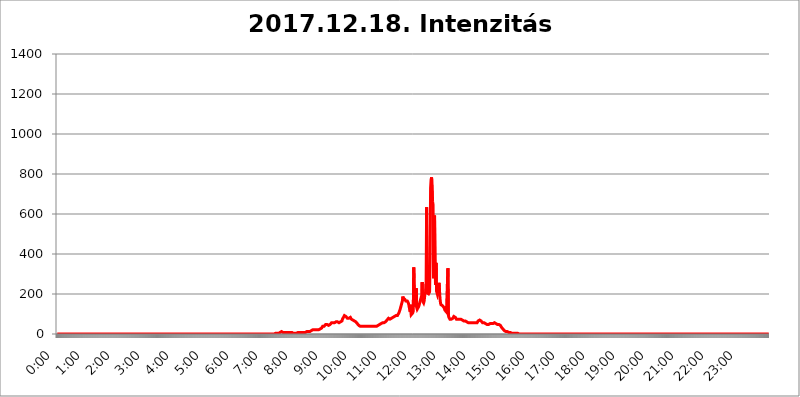
| Category | 2017.12.18. Intenzitás [W/m^2] |
|---|---|
| 0.0 | 0 |
| 0.0006944444444444445 | 0 |
| 0.001388888888888889 | 0 |
| 0.0020833333333333333 | 0 |
| 0.002777777777777778 | 0 |
| 0.003472222222222222 | 0 |
| 0.004166666666666667 | 0 |
| 0.004861111111111111 | 0 |
| 0.005555555555555556 | 0 |
| 0.0062499999999999995 | 0 |
| 0.006944444444444444 | 0 |
| 0.007638888888888889 | 0 |
| 0.008333333333333333 | 0 |
| 0.009027777777777779 | 0 |
| 0.009722222222222222 | 0 |
| 0.010416666666666666 | 0 |
| 0.011111111111111112 | 0 |
| 0.011805555555555555 | 0 |
| 0.012499999999999999 | 0 |
| 0.013194444444444444 | 0 |
| 0.013888888888888888 | 0 |
| 0.014583333333333332 | 0 |
| 0.015277777777777777 | 0 |
| 0.015972222222222224 | 0 |
| 0.016666666666666666 | 0 |
| 0.017361111111111112 | 0 |
| 0.018055555555555557 | 0 |
| 0.01875 | 0 |
| 0.019444444444444445 | 0 |
| 0.02013888888888889 | 0 |
| 0.020833333333333332 | 0 |
| 0.02152777777777778 | 0 |
| 0.022222222222222223 | 0 |
| 0.02291666666666667 | 0 |
| 0.02361111111111111 | 0 |
| 0.024305555555555556 | 0 |
| 0.024999999999999998 | 0 |
| 0.025694444444444447 | 0 |
| 0.02638888888888889 | 0 |
| 0.027083333333333334 | 0 |
| 0.027777777777777776 | 0 |
| 0.02847222222222222 | 0 |
| 0.029166666666666664 | 0 |
| 0.029861111111111113 | 0 |
| 0.030555555555555555 | 0 |
| 0.03125 | 0 |
| 0.03194444444444445 | 0 |
| 0.03263888888888889 | 0 |
| 0.03333333333333333 | 0 |
| 0.034027777777777775 | 0 |
| 0.034722222222222224 | 0 |
| 0.035416666666666666 | 0 |
| 0.036111111111111115 | 0 |
| 0.03680555555555556 | 0 |
| 0.0375 | 0 |
| 0.03819444444444444 | 0 |
| 0.03888888888888889 | 0 |
| 0.03958333333333333 | 0 |
| 0.04027777777777778 | 0 |
| 0.04097222222222222 | 0 |
| 0.041666666666666664 | 0 |
| 0.042361111111111106 | 0 |
| 0.04305555555555556 | 0 |
| 0.043750000000000004 | 0 |
| 0.044444444444444446 | 0 |
| 0.04513888888888889 | 0 |
| 0.04583333333333334 | 0 |
| 0.04652777777777778 | 0 |
| 0.04722222222222222 | 0 |
| 0.04791666666666666 | 0 |
| 0.04861111111111111 | 0 |
| 0.049305555555555554 | 0 |
| 0.049999999999999996 | 0 |
| 0.05069444444444445 | 0 |
| 0.051388888888888894 | 0 |
| 0.052083333333333336 | 0 |
| 0.05277777777777778 | 0 |
| 0.05347222222222222 | 0 |
| 0.05416666666666667 | 0 |
| 0.05486111111111111 | 0 |
| 0.05555555555555555 | 0 |
| 0.05625 | 0 |
| 0.05694444444444444 | 0 |
| 0.057638888888888885 | 0 |
| 0.05833333333333333 | 0 |
| 0.05902777777777778 | 0 |
| 0.059722222222222225 | 0 |
| 0.06041666666666667 | 0 |
| 0.061111111111111116 | 0 |
| 0.06180555555555556 | 0 |
| 0.0625 | 0 |
| 0.06319444444444444 | 0 |
| 0.06388888888888888 | 0 |
| 0.06458333333333334 | 0 |
| 0.06527777777777778 | 0 |
| 0.06597222222222222 | 0 |
| 0.06666666666666667 | 0 |
| 0.06736111111111111 | 0 |
| 0.06805555555555555 | 0 |
| 0.06874999999999999 | 0 |
| 0.06944444444444443 | 0 |
| 0.07013888888888889 | 0 |
| 0.07083333333333333 | 0 |
| 0.07152777777777779 | 0 |
| 0.07222222222222223 | 0 |
| 0.07291666666666667 | 0 |
| 0.07361111111111111 | 0 |
| 0.07430555555555556 | 0 |
| 0.075 | 0 |
| 0.07569444444444444 | 0 |
| 0.0763888888888889 | 0 |
| 0.07708333333333334 | 0 |
| 0.07777777777777778 | 0 |
| 0.07847222222222222 | 0 |
| 0.07916666666666666 | 0 |
| 0.0798611111111111 | 0 |
| 0.08055555555555556 | 0 |
| 0.08125 | 0 |
| 0.08194444444444444 | 0 |
| 0.08263888888888889 | 0 |
| 0.08333333333333333 | 0 |
| 0.08402777777777777 | 0 |
| 0.08472222222222221 | 0 |
| 0.08541666666666665 | 0 |
| 0.08611111111111112 | 0 |
| 0.08680555555555557 | 0 |
| 0.08750000000000001 | 0 |
| 0.08819444444444445 | 0 |
| 0.08888888888888889 | 0 |
| 0.08958333333333333 | 0 |
| 0.09027777777777778 | 0 |
| 0.09097222222222222 | 0 |
| 0.09166666666666667 | 0 |
| 0.09236111111111112 | 0 |
| 0.09305555555555556 | 0 |
| 0.09375 | 0 |
| 0.09444444444444444 | 0 |
| 0.09513888888888888 | 0 |
| 0.09583333333333333 | 0 |
| 0.09652777777777777 | 0 |
| 0.09722222222222222 | 0 |
| 0.09791666666666667 | 0 |
| 0.09861111111111111 | 0 |
| 0.09930555555555555 | 0 |
| 0.09999999999999999 | 0 |
| 0.10069444444444443 | 0 |
| 0.1013888888888889 | 0 |
| 0.10208333333333335 | 0 |
| 0.10277777777777779 | 0 |
| 0.10347222222222223 | 0 |
| 0.10416666666666667 | 0 |
| 0.10486111111111111 | 0 |
| 0.10555555555555556 | 0 |
| 0.10625 | 0 |
| 0.10694444444444444 | 0 |
| 0.1076388888888889 | 0 |
| 0.10833333333333334 | 0 |
| 0.10902777777777778 | 0 |
| 0.10972222222222222 | 0 |
| 0.1111111111111111 | 0 |
| 0.11180555555555556 | 0 |
| 0.11180555555555556 | 0 |
| 0.1125 | 0 |
| 0.11319444444444444 | 0 |
| 0.11388888888888889 | 0 |
| 0.11458333333333333 | 0 |
| 0.11527777777777777 | 0 |
| 0.11597222222222221 | 0 |
| 0.11666666666666665 | 0 |
| 0.1173611111111111 | 0 |
| 0.11805555555555557 | 0 |
| 0.11944444444444445 | 0 |
| 0.12013888888888889 | 0 |
| 0.12083333333333333 | 0 |
| 0.12152777777777778 | 0 |
| 0.12222222222222223 | 0 |
| 0.12291666666666667 | 0 |
| 0.12291666666666667 | 0 |
| 0.12361111111111112 | 0 |
| 0.12430555555555556 | 0 |
| 0.125 | 0 |
| 0.12569444444444444 | 0 |
| 0.12638888888888888 | 0 |
| 0.12708333333333333 | 0 |
| 0.16875 | 0 |
| 0.12847222222222224 | 0 |
| 0.12916666666666668 | 0 |
| 0.12986111111111112 | 0 |
| 0.13055555555555556 | 0 |
| 0.13125 | 0 |
| 0.13194444444444445 | 0 |
| 0.1326388888888889 | 0 |
| 0.13333333333333333 | 0 |
| 0.13402777777777777 | 0 |
| 0.13402777777777777 | 0 |
| 0.13472222222222222 | 0 |
| 0.13541666666666666 | 0 |
| 0.1361111111111111 | 0 |
| 0.13749999999999998 | 0 |
| 0.13819444444444443 | 0 |
| 0.1388888888888889 | 0 |
| 0.13958333333333334 | 0 |
| 0.14027777777777778 | 0 |
| 0.14097222222222222 | 0 |
| 0.14166666666666666 | 0 |
| 0.1423611111111111 | 0 |
| 0.14305555555555557 | 0 |
| 0.14375000000000002 | 0 |
| 0.14444444444444446 | 0 |
| 0.1451388888888889 | 0 |
| 0.1451388888888889 | 0 |
| 0.14652777777777778 | 0 |
| 0.14722222222222223 | 0 |
| 0.14791666666666667 | 0 |
| 0.1486111111111111 | 0 |
| 0.14930555555555555 | 0 |
| 0.15 | 0 |
| 0.15069444444444444 | 0 |
| 0.15138888888888888 | 0 |
| 0.15208333333333332 | 0 |
| 0.15277777777777776 | 0 |
| 0.15347222222222223 | 0 |
| 0.15416666666666667 | 0 |
| 0.15486111111111112 | 0 |
| 0.15555555555555556 | 0 |
| 0.15625 | 0 |
| 0.15694444444444444 | 0 |
| 0.15763888888888888 | 0 |
| 0.15833333333333333 | 0 |
| 0.15902777777777777 | 0 |
| 0.15972222222222224 | 0 |
| 0.16041666666666668 | 0 |
| 0.16111111111111112 | 0 |
| 0.16180555555555556 | 0 |
| 0.1625 | 0 |
| 0.16319444444444445 | 0 |
| 0.1638888888888889 | 0 |
| 0.16458333333333333 | 0 |
| 0.16527777777777777 | 0 |
| 0.16597222222222222 | 0 |
| 0.16666666666666666 | 0 |
| 0.1673611111111111 | 0 |
| 0.16805555555555554 | 0 |
| 0.16874999999999998 | 0 |
| 0.16944444444444443 | 0 |
| 0.17013888888888887 | 0 |
| 0.1708333333333333 | 0 |
| 0.17152777777777775 | 0 |
| 0.17222222222222225 | 0 |
| 0.1729166666666667 | 0 |
| 0.17361111111111113 | 0 |
| 0.17430555555555557 | 0 |
| 0.17500000000000002 | 0 |
| 0.17569444444444446 | 0 |
| 0.1763888888888889 | 0 |
| 0.17708333333333334 | 0 |
| 0.17777777777777778 | 0 |
| 0.17847222222222223 | 0 |
| 0.17916666666666667 | 0 |
| 0.1798611111111111 | 0 |
| 0.18055555555555555 | 0 |
| 0.18125 | 0 |
| 0.18194444444444444 | 0 |
| 0.1826388888888889 | 0 |
| 0.18333333333333335 | 0 |
| 0.1840277777777778 | 0 |
| 0.18472222222222223 | 0 |
| 0.18541666666666667 | 0 |
| 0.18611111111111112 | 0 |
| 0.18680555555555556 | 0 |
| 0.1875 | 0 |
| 0.18819444444444444 | 0 |
| 0.18888888888888888 | 0 |
| 0.18958333333333333 | 0 |
| 0.19027777777777777 | 0 |
| 0.1909722222222222 | 0 |
| 0.19166666666666665 | 0 |
| 0.19236111111111112 | 0 |
| 0.19305555555555554 | 0 |
| 0.19375 | 0 |
| 0.19444444444444445 | 0 |
| 0.1951388888888889 | 0 |
| 0.19583333333333333 | 0 |
| 0.19652777777777777 | 0 |
| 0.19722222222222222 | 0 |
| 0.19791666666666666 | 0 |
| 0.1986111111111111 | 0 |
| 0.19930555555555554 | 0 |
| 0.19999999999999998 | 0 |
| 0.20069444444444443 | 0 |
| 0.20138888888888887 | 0 |
| 0.2020833333333333 | 0 |
| 0.2027777777777778 | 0 |
| 0.2034722222222222 | 0 |
| 0.2041666666666667 | 0 |
| 0.20486111111111113 | 0 |
| 0.20555555555555557 | 0 |
| 0.20625000000000002 | 0 |
| 0.20694444444444446 | 0 |
| 0.2076388888888889 | 0 |
| 0.20833333333333334 | 0 |
| 0.20902777777777778 | 0 |
| 0.20972222222222223 | 0 |
| 0.21041666666666667 | 0 |
| 0.2111111111111111 | 0 |
| 0.21180555555555555 | 0 |
| 0.2125 | 0 |
| 0.21319444444444444 | 0 |
| 0.2138888888888889 | 0 |
| 0.21458333333333335 | 0 |
| 0.2152777777777778 | 0 |
| 0.21597222222222223 | 0 |
| 0.21666666666666667 | 0 |
| 0.21736111111111112 | 0 |
| 0.21805555555555556 | 0 |
| 0.21875 | 0 |
| 0.21944444444444444 | 0 |
| 0.22013888888888888 | 0 |
| 0.22083333333333333 | 0 |
| 0.22152777777777777 | 0 |
| 0.2222222222222222 | 0 |
| 0.22291666666666665 | 0 |
| 0.2236111111111111 | 0 |
| 0.22430555555555556 | 0 |
| 0.225 | 0 |
| 0.22569444444444445 | 0 |
| 0.2263888888888889 | 0 |
| 0.22708333333333333 | 0 |
| 0.22777777777777777 | 0 |
| 0.22847222222222222 | 0 |
| 0.22916666666666666 | 0 |
| 0.2298611111111111 | 0 |
| 0.23055555555555554 | 0 |
| 0.23124999999999998 | 0 |
| 0.23194444444444443 | 0 |
| 0.23263888888888887 | 0 |
| 0.2333333333333333 | 0 |
| 0.2340277777777778 | 0 |
| 0.2347222222222222 | 0 |
| 0.2354166666666667 | 0 |
| 0.23611111111111113 | 0 |
| 0.23680555555555557 | 0 |
| 0.23750000000000002 | 0 |
| 0.23819444444444446 | 0 |
| 0.2388888888888889 | 0 |
| 0.23958333333333334 | 0 |
| 0.24027777777777778 | 0 |
| 0.24097222222222223 | 0 |
| 0.24166666666666667 | 0 |
| 0.2423611111111111 | 0 |
| 0.24305555555555555 | 0 |
| 0.24375 | 0 |
| 0.24444444444444446 | 0 |
| 0.24513888888888888 | 0 |
| 0.24583333333333335 | 0 |
| 0.2465277777777778 | 0 |
| 0.24722222222222223 | 0 |
| 0.24791666666666667 | 0 |
| 0.24861111111111112 | 0 |
| 0.24930555555555556 | 0 |
| 0.25 | 0 |
| 0.25069444444444444 | 0 |
| 0.2513888888888889 | 0 |
| 0.2520833333333333 | 0 |
| 0.25277777777777777 | 0 |
| 0.2534722222222222 | 0 |
| 0.25416666666666665 | 0 |
| 0.2548611111111111 | 0 |
| 0.2555555555555556 | 0 |
| 0.25625000000000003 | 0 |
| 0.2569444444444445 | 0 |
| 0.2576388888888889 | 0 |
| 0.25833333333333336 | 0 |
| 0.2590277777777778 | 0 |
| 0.25972222222222224 | 0 |
| 0.2604166666666667 | 0 |
| 0.2611111111111111 | 0 |
| 0.26180555555555557 | 0 |
| 0.2625 | 0 |
| 0.26319444444444445 | 0 |
| 0.2638888888888889 | 0 |
| 0.26458333333333334 | 0 |
| 0.2652777777777778 | 0 |
| 0.2659722222222222 | 0 |
| 0.26666666666666666 | 0 |
| 0.2673611111111111 | 0 |
| 0.26805555555555555 | 0 |
| 0.26875 | 0 |
| 0.26944444444444443 | 0 |
| 0.2701388888888889 | 0 |
| 0.2708333333333333 | 0 |
| 0.27152777777777776 | 0 |
| 0.2722222222222222 | 0 |
| 0.27291666666666664 | 0 |
| 0.2736111111111111 | 0 |
| 0.2743055555555555 | 0 |
| 0.27499999999999997 | 0 |
| 0.27569444444444446 | 0 |
| 0.27638888888888885 | 0 |
| 0.27708333333333335 | 0 |
| 0.2777777777777778 | 0 |
| 0.27847222222222223 | 0 |
| 0.2791666666666667 | 0 |
| 0.2798611111111111 | 0 |
| 0.28055555555555556 | 0 |
| 0.28125 | 0 |
| 0.28194444444444444 | 0 |
| 0.2826388888888889 | 0 |
| 0.2833333333333333 | 0 |
| 0.28402777777777777 | 0 |
| 0.2847222222222222 | 0 |
| 0.28541666666666665 | 0 |
| 0.28611111111111115 | 0 |
| 0.28680555555555554 | 0 |
| 0.28750000000000003 | 0 |
| 0.2881944444444445 | 0 |
| 0.2888888888888889 | 0 |
| 0.28958333333333336 | 0 |
| 0.2902777777777778 | 0 |
| 0.29097222222222224 | 0 |
| 0.2916666666666667 | 0 |
| 0.2923611111111111 | 0 |
| 0.29305555555555557 | 0 |
| 0.29375 | 0 |
| 0.29444444444444445 | 0 |
| 0.2951388888888889 | 0 |
| 0.29583333333333334 | 0 |
| 0.2965277777777778 | 0 |
| 0.2972222222222222 | 0 |
| 0.29791666666666666 | 0 |
| 0.2986111111111111 | 0 |
| 0.29930555555555555 | 0 |
| 0.3 | 0 |
| 0.30069444444444443 | 0 |
| 0.3013888888888889 | 0 |
| 0.3020833333333333 | 0 |
| 0.30277777777777776 | 0 |
| 0.3034722222222222 | 0 |
| 0.30416666666666664 | 0 |
| 0.3048611111111111 | 0 |
| 0.3055555555555555 | 0 |
| 0.30624999999999997 | 3.525 |
| 0.3069444444444444 | 3.525 |
| 0.3076388888888889 | 3.525 |
| 0.30833333333333335 | 3.525 |
| 0.3090277777777778 | 3.525 |
| 0.30972222222222223 | 3.525 |
| 0.3104166666666667 | 3.525 |
| 0.3111111111111111 | 7.887 |
| 0.31180555555555556 | 7.887 |
| 0.3125 | 7.887 |
| 0.31319444444444444 | 7.887 |
| 0.3138888888888889 | 12.257 |
| 0.3145833333333333 | 12.257 |
| 0.31527777777777777 | 12.257 |
| 0.3159722222222222 | 7.887 |
| 0.31666666666666665 | 7.887 |
| 0.31736111111111115 | 7.887 |
| 0.31805555555555554 | 7.887 |
| 0.31875000000000003 | 7.887 |
| 0.3194444444444445 | 7.887 |
| 0.3201388888888889 | 7.887 |
| 0.32083333333333336 | 7.887 |
| 0.3215277777777778 | 7.887 |
| 0.32222222222222224 | 7.887 |
| 0.3229166666666667 | 7.887 |
| 0.3236111111111111 | 7.887 |
| 0.32430555555555557 | 7.887 |
| 0.325 | 7.887 |
| 0.32569444444444445 | 7.887 |
| 0.3263888888888889 | 7.887 |
| 0.32708333333333334 | 7.887 |
| 0.3277777777777778 | 7.887 |
| 0.3284722222222222 | 7.887 |
| 0.32916666666666666 | 7.887 |
| 0.3298611111111111 | 7.887 |
| 0.33055555555555555 | 3.525 |
| 0.33125 | 3.525 |
| 0.33194444444444443 | 3.525 |
| 0.3326388888888889 | 3.525 |
| 0.3333333333333333 | 3.525 |
| 0.3340277777777778 | 3.525 |
| 0.3347222222222222 | 3.525 |
| 0.3354166666666667 | 3.525 |
| 0.3361111111111111 | 3.525 |
| 0.3368055555555556 | 7.887 |
| 0.33749999999999997 | 7.887 |
| 0.33819444444444446 | 7.887 |
| 0.33888888888888885 | 7.887 |
| 0.33958333333333335 | 7.887 |
| 0.34027777777777773 | 7.887 |
| 0.34097222222222223 | 7.887 |
| 0.3416666666666666 | 7.887 |
| 0.3423611111111111 | 7.887 |
| 0.3430555555555555 | 7.887 |
| 0.34375 | 7.887 |
| 0.3444444444444445 | 7.887 |
| 0.3451388888888889 | 7.887 |
| 0.3458333333333334 | 7.887 |
| 0.34652777777777777 | 7.887 |
| 0.34722222222222227 | 7.887 |
| 0.34791666666666665 | 7.887 |
| 0.34861111111111115 | 7.887 |
| 0.34930555555555554 | 12.257 |
| 0.35000000000000003 | 12.257 |
| 0.3506944444444444 | 12.257 |
| 0.3513888888888889 | 12.257 |
| 0.3520833333333333 | 12.257 |
| 0.3527777777777778 | 12.257 |
| 0.3534722222222222 | 12.257 |
| 0.3541666666666667 | 12.257 |
| 0.3548611111111111 | 16.636 |
| 0.35555555555555557 | 16.636 |
| 0.35625 | 16.636 |
| 0.35694444444444445 | 16.636 |
| 0.3576388888888889 | 16.636 |
| 0.35833333333333334 | 21.024 |
| 0.3590277777777778 | 16.636 |
| 0.3597222222222222 | 16.636 |
| 0.36041666666666666 | 21.024 |
| 0.3611111111111111 | 21.024 |
| 0.36180555555555555 | 21.024 |
| 0.3625 | 21.024 |
| 0.36319444444444443 | 21.024 |
| 0.3638888888888889 | 21.024 |
| 0.3645833333333333 | 21.024 |
| 0.3652777777777778 | 21.024 |
| 0.3659722222222222 | 21.024 |
| 0.3666666666666667 | 21.024 |
| 0.3673611111111111 | 21.024 |
| 0.3680555555555556 | 25.419 |
| 0.36874999999999997 | 25.419 |
| 0.36944444444444446 | 29.823 |
| 0.37013888888888885 | 29.823 |
| 0.37083333333333335 | 29.823 |
| 0.37152777777777773 | 34.234 |
| 0.37222222222222223 | 38.653 |
| 0.3729166666666666 | 38.653 |
| 0.3736111111111111 | 38.653 |
| 0.3743055555555555 | 38.653 |
| 0.375 | 43.079 |
| 0.3756944444444445 | 43.079 |
| 0.3763888888888889 | 47.511 |
| 0.3770833333333334 | 47.511 |
| 0.37777777777777777 | 47.511 |
| 0.37847222222222227 | 47.511 |
| 0.37916666666666665 | 47.511 |
| 0.37986111111111115 | 43.079 |
| 0.38055555555555554 | 43.079 |
| 0.38125000000000003 | 43.079 |
| 0.3819444444444444 | 47.511 |
| 0.3826388888888889 | 47.511 |
| 0.3833333333333333 | 47.511 |
| 0.3840277777777778 | 51.951 |
| 0.3847222222222222 | 56.398 |
| 0.3854166666666667 | 56.398 |
| 0.3861111111111111 | 56.398 |
| 0.38680555555555557 | 56.398 |
| 0.3875 | 56.398 |
| 0.38819444444444445 | 56.398 |
| 0.3888888888888889 | 56.398 |
| 0.38958333333333334 | 56.398 |
| 0.3902777777777778 | 60.85 |
| 0.3909722222222222 | 60.85 |
| 0.39166666666666666 | 60.85 |
| 0.3923611111111111 | 60.85 |
| 0.39305555555555555 | 60.85 |
| 0.39375 | 60.85 |
| 0.39444444444444443 | 60.85 |
| 0.3951388888888889 | 56.398 |
| 0.3958333333333333 | 56.398 |
| 0.3965277777777778 | 56.398 |
| 0.3972222222222222 | 60.85 |
| 0.3979166666666667 | 60.85 |
| 0.3986111111111111 | 65.31 |
| 0.3993055555555556 | 65.31 |
| 0.39999999999999997 | 74.246 |
| 0.40069444444444446 | 78.722 |
| 0.40138888888888885 | 83.205 |
| 0.40208333333333335 | 87.692 |
| 0.40277777777777773 | 92.184 |
| 0.40347222222222223 | 92.184 |
| 0.4041666666666666 | 92.184 |
| 0.4048611111111111 | 87.692 |
| 0.4055555555555555 | 83.205 |
| 0.40625 | 83.205 |
| 0.4069444444444445 | 78.722 |
| 0.4076388888888889 | 78.722 |
| 0.4083333333333334 | 78.722 |
| 0.40902777777777777 | 78.722 |
| 0.40972222222222227 | 78.722 |
| 0.41041666666666665 | 78.722 |
| 0.41111111111111115 | 83.205 |
| 0.41180555555555554 | 78.722 |
| 0.41250000000000003 | 74.246 |
| 0.4131944444444444 | 74.246 |
| 0.4138888888888889 | 69.775 |
| 0.4145833333333333 | 69.775 |
| 0.4152777777777778 | 65.31 |
| 0.4159722222222222 | 65.31 |
| 0.4166666666666667 | 65.31 |
| 0.4173611111111111 | 65.31 |
| 0.41805555555555557 | 65.31 |
| 0.41875 | 60.85 |
| 0.41944444444444445 | 60.85 |
| 0.4201388888888889 | 56.398 |
| 0.42083333333333334 | 51.951 |
| 0.4215277777777778 | 51.951 |
| 0.4222222222222222 | 47.511 |
| 0.42291666666666666 | 43.079 |
| 0.4236111111111111 | 43.079 |
| 0.42430555555555555 | 38.653 |
| 0.425 | 38.653 |
| 0.42569444444444443 | 38.653 |
| 0.4263888888888889 | 38.653 |
| 0.4270833333333333 | 38.653 |
| 0.4277777777777778 | 38.653 |
| 0.4284722222222222 | 38.653 |
| 0.4291666666666667 | 38.653 |
| 0.4298611111111111 | 38.653 |
| 0.4305555555555556 | 38.653 |
| 0.43124999999999997 | 38.653 |
| 0.43194444444444446 | 38.653 |
| 0.43263888888888885 | 38.653 |
| 0.43333333333333335 | 38.653 |
| 0.43402777777777773 | 38.653 |
| 0.43472222222222223 | 38.653 |
| 0.4354166666666666 | 38.653 |
| 0.4361111111111111 | 38.653 |
| 0.4368055555555555 | 38.653 |
| 0.4375 | 38.653 |
| 0.4381944444444445 | 38.653 |
| 0.4388888888888889 | 38.653 |
| 0.4395833333333334 | 38.653 |
| 0.44027777777777777 | 43.079 |
| 0.44097222222222227 | 43.079 |
| 0.44166666666666665 | 38.653 |
| 0.44236111111111115 | 38.653 |
| 0.44305555555555554 | 38.653 |
| 0.44375000000000003 | 38.653 |
| 0.4444444444444444 | 38.653 |
| 0.4451388888888889 | 43.079 |
| 0.4458333333333333 | 38.653 |
| 0.4465277777777778 | 38.653 |
| 0.4472222222222222 | 38.653 |
| 0.4479166666666667 | 38.653 |
| 0.4486111111111111 | 38.653 |
| 0.44930555555555557 | 43.079 |
| 0.45 | 43.079 |
| 0.45069444444444445 | 43.079 |
| 0.4513888888888889 | 43.079 |
| 0.45208333333333334 | 47.511 |
| 0.4527777777777778 | 47.511 |
| 0.4534722222222222 | 47.511 |
| 0.45416666666666666 | 51.951 |
| 0.4548611111111111 | 51.951 |
| 0.45555555555555555 | 56.398 |
| 0.45625 | 56.398 |
| 0.45694444444444443 | 56.398 |
| 0.4576388888888889 | 56.398 |
| 0.4583333333333333 | 56.398 |
| 0.4590277777777778 | 56.398 |
| 0.4597222222222222 | 60.85 |
| 0.4604166666666667 | 60.85 |
| 0.4611111111111111 | 65.31 |
| 0.4618055555555556 | 65.31 |
| 0.46249999999999997 | 69.775 |
| 0.46319444444444446 | 74.246 |
| 0.46388888888888885 | 74.246 |
| 0.46458333333333335 | 78.722 |
| 0.46527777777777773 | 78.722 |
| 0.46597222222222223 | 78.722 |
| 0.4666666666666666 | 74.246 |
| 0.4673611111111111 | 74.246 |
| 0.4680555555555555 | 78.722 |
| 0.46875 | 78.722 |
| 0.4694444444444445 | 83.205 |
| 0.4701388888888889 | 83.205 |
| 0.4708333333333334 | 83.205 |
| 0.47152777777777777 | 83.205 |
| 0.47222222222222227 | 87.692 |
| 0.47291666666666665 | 87.692 |
| 0.47361111111111115 | 92.184 |
| 0.47430555555555554 | 92.184 |
| 0.47500000000000003 | 92.184 |
| 0.4756944444444444 | 87.692 |
| 0.4763888888888889 | 87.692 |
| 0.4770833333333333 | 92.184 |
| 0.4777777777777778 | 92.184 |
| 0.4784722222222222 | 96.682 |
| 0.4791666666666667 | 105.69 |
| 0.4798611111111111 | 110.201 |
| 0.48055555555555557 | 119.235 |
| 0.48125 | 128.284 |
| 0.48194444444444445 | 137.347 |
| 0.4826388888888889 | 146.423 |
| 0.48333333333333334 | 155.509 |
| 0.4840277777777778 | 164.605 |
| 0.4847222222222222 | 187.378 |
| 0.48541666666666666 | 178.264 |
| 0.4861111111111111 | 182.82 |
| 0.48680555555555555 | 178.264 |
| 0.4875 | 173.709 |
| 0.48819444444444443 | 169.156 |
| 0.4888888888888889 | 164.605 |
| 0.4895833333333333 | 164.605 |
| 0.4902777777777778 | 164.605 |
| 0.4909722222222222 | 164.605 |
| 0.4916666666666667 | 160.056 |
| 0.4923611111111111 | 155.509 |
| 0.4930555555555556 | 146.423 |
| 0.49374999999999997 | 132.814 |
| 0.49444444444444446 | 119.235 |
| 0.49513888888888885 | 110.201 |
| 0.49583333333333335 | 146.423 |
| 0.49652777777777773 | 96.682 |
| 0.49722222222222223 | 96.682 |
| 0.4979166666666666 | 101.184 |
| 0.4986111111111111 | 105.69 |
| 0.4993055555555555 | 114.716 |
| 0.5 | 333.113 |
| 0.5006944444444444 | 219.309 |
| 0.5013888888888889 | 137.347 |
| 0.5020833333333333 | 132.814 |
| 0.5027777777777778 | 132.814 |
| 0.5034722222222222 | 228.436 |
| 0.5041666666666667 | 132.814 |
| 0.5048611111111111 | 123.758 |
| 0.5055555555555555 | 123.758 |
| 0.50625 | 123.758 |
| 0.5069444444444444 | 137.347 |
| 0.5076388888888889 | 146.423 |
| 0.5083333333333333 | 150.964 |
| 0.5090277777777777 | 164.605 |
| 0.5097222222222222 | 173.709 |
| 0.5104166666666666 | 169.156 |
| 0.5111111111111112 | 191.937 |
| 0.5118055555555555 | 260.373 |
| 0.5125000000000001 | 164.605 |
| 0.5131944444444444 | 160.056 |
| 0.513888888888889 | 155.509 |
| 0.5145833333333333 | 164.605 |
| 0.5152777777777778 | 187.378 |
| 0.5159722222222222 | 210.182 |
| 0.5166666666666667 | 201.058 |
| 0.517361111111111 | 251.251 |
| 0.5180555555555556 | 634.105 |
| 0.5187499999999999 | 205.62 |
| 0.5194444444444445 | 201.058 |
| 0.5201388888888888 | 201.058 |
| 0.5208333333333334 | 201.058 |
| 0.5215277777777778 | 201.058 |
| 0.5222222222222223 | 210.182 |
| 0.5229166666666667 | 382.715 |
| 0.5236111111111111 | 727.896 |
| 0.5243055555555556 | 771.559 |
| 0.525 | 783.342 |
| 0.5256944444444445 | 779.42 |
| 0.5263888888888889 | 663.019 |
| 0.5270833333333333 | 646.537 |
| 0.5277777777777778 | 278.603 |
| 0.5284722222222222 | 467.187 |
| 0.5291666666666667 | 592.233 |
| 0.5298611111111111 | 342.162 |
| 0.5305555555555556 | 246.689 |
| 0.53125 | 355.712 |
| 0.5319444444444444 | 214.746 |
| 0.5326388888888889 | 205.62 |
| 0.5333333333333333 | 196.497 |
| 0.5340277777777778 | 205.62 |
| 0.5347222222222222 | 201.058 |
| 0.5354166666666667 | 255.813 |
| 0.5361111111111111 | 219.309 |
| 0.5368055555555555 | 178.264 |
| 0.5375 | 155.509 |
| 0.5381944444444444 | 146.423 |
| 0.5388888888888889 | 146.423 |
| 0.5395833333333333 | 141.884 |
| 0.5402777777777777 | 141.884 |
| 0.5409722222222222 | 141.884 |
| 0.5416666666666666 | 137.347 |
| 0.5423611111111112 | 132.814 |
| 0.5430555555555555 | 128.284 |
| 0.5437500000000001 | 119.235 |
| 0.5444444444444444 | 123.758 |
| 0.545138888888889 | 114.716 |
| 0.5458333333333333 | 110.201 |
| 0.5465277777777778 | 105.69 |
| 0.5472222222222222 | 105.69 |
| 0.5479166666666667 | 328.584 |
| 0.548611111111111 | 92.184 |
| 0.5493055555555556 | 83.205 |
| 0.5499999999999999 | 78.722 |
| 0.5506944444444445 | 74.246 |
| 0.5513888888888888 | 74.246 |
| 0.5520833333333334 | 74.246 |
| 0.5527777777777778 | 74.246 |
| 0.5534722222222223 | 74.246 |
| 0.5541666666666667 | 78.722 |
| 0.5548611111111111 | 78.722 |
| 0.5555555555555556 | 83.205 |
| 0.55625 | 87.692 |
| 0.5569444444444445 | 87.692 |
| 0.5576388888888889 | 87.692 |
| 0.5583333333333333 | 83.205 |
| 0.5590277777777778 | 78.722 |
| 0.5597222222222222 | 74.246 |
| 0.5604166666666667 | 74.246 |
| 0.5611111111111111 | 69.775 |
| 0.5618055555555556 | 74.246 |
| 0.5625 | 74.246 |
| 0.5631944444444444 | 74.246 |
| 0.5638888888888889 | 74.246 |
| 0.5645833333333333 | 74.246 |
| 0.5652777777777778 | 74.246 |
| 0.5659722222222222 | 74.246 |
| 0.5666666666666667 | 69.775 |
| 0.5673611111111111 | 69.775 |
| 0.5680555555555555 | 69.775 |
| 0.56875 | 65.31 |
| 0.5694444444444444 | 65.31 |
| 0.5701388888888889 | 65.31 |
| 0.5708333333333333 | 65.31 |
| 0.5715277777777777 | 65.31 |
| 0.5722222222222222 | 65.31 |
| 0.5729166666666666 | 60.85 |
| 0.5736111111111112 | 60.85 |
| 0.5743055555555555 | 60.85 |
| 0.5750000000000001 | 56.398 |
| 0.5756944444444444 | 56.398 |
| 0.576388888888889 | 56.398 |
| 0.5770833333333333 | 56.398 |
| 0.5777777777777778 | 56.398 |
| 0.5784722222222222 | 56.398 |
| 0.5791666666666667 | 56.398 |
| 0.579861111111111 | 56.398 |
| 0.5805555555555556 | 56.398 |
| 0.5812499999999999 | 56.398 |
| 0.5819444444444445 | 56.398 |
| 0.5826388888888888 | 56.398 |
| 0.5833333333333334 | 56.398 |
| 0.5840277777777778 | 56.398 |
| 0.5847222222222223 | 56.398 |
| 0.5854166666666667 | 56.398 |
| 0.5861111111111111 | 56.398 |
| 0.5868055555555556 | 56.398 |
| 0.5875 | 56.398 |
| 0.5881944444444445 | 56.398 |
| 0.5888888888888889 | 56.398 |
| 0.5895833333333333 | 60.85 |
| 0.5902777777777778 | 65.31 |
| 0.5909722222222222 | 69.775 |
| 0.5916666666666667 | 69.775 |
| 0.5923611111111111 | 69.775 |
| 0.5930555555555556 | 69.775 |
| 0.59375 | 69.775 |
| 0.5944444444444444 | 65.31 |
| 0.5951388888888889 | 65.31 |
| 0.5958333333333333 | 60.85 |
| 0.5965277777777778 | 56.398 |
| 0.5972222222222222 | 56.398 |
| 0.5979166666666667 | 56.398 |
| 0.5986111111111111 | 56.398 |
| 0.5993055555555555 | 56.398 |
| 0.6 | 51.951 |
| 0.6006944444444444 | 51.951 |
| 0.6013888888888889 | 51.951 |
| 0.6020833333333333 | 51.951 |
| 0.6027777777777777 | 47.511 |
| 0.6034722222222222 | 47.511 |
| 0.6041666666666666 | 47.511 |
| 0.6048611111111112 | 47.511 |
| 0.6055555555555555 | 51.951 |
| 0.6062500000000001 | 51.951 |
| 0.6069444444444444 | 51.951 |
| 0.607638888888889 | 51.951 |
| 0.6083333333333333 | 51.951 |
| 0.6090277777777778 | 51.951 |
| 0.6097222222222222 | 51.951 |
| 0.6104166666666667 | 51.951 |
| 0.611111111111111 | 51.951 |
| 0.6118055555555556 | 51.951 |
| 0.6124999999999999 | 56.398 |
| 0.6131944444444445 | 56.398 |
| 0.6138888888888888 | 51.951 |
| 0.6145833333333334 | 51.951 |
| 0.6152777777777778 | 51.951 |
| 0.6159722222222223 | 51.951 |
| 0.6166666666666667 | 47.511 |
| 0.6173611111111111 | 47.511 |
| 0.6180555555555556 | 47.511 |
| 0.61875 | 47.511 |
| 0.6194444444444445 | 47.511 |
| 0.6201388888888889 | 47.511 |
| 0.6208333333333333 | 47.511 |
| 0.6215277777777778 | 43.079 |
| 0.6222222222222222 | 38.653 |
| 0.6229166666666667 | 34.234 |
| 0.6236111111111111 | 34.234 |
| 0.6243055555555556 | 29.823 |
| 0.625 | 25.419 |
| 0.6256944444444444 | 21.024 |
| 0.6263888888888889 | 21.024 |
| 0.6270833333333333 | 16.636 |
| 0.6277777777777778 | 16.636 |
| 0.6284722222222222 | 16.636 |
| 0.6291666666666667 | 12.257 |
| 0.6298611111111111 | 12.257 |
| 0.6305555555555555 | 12.257 |
| 0.63125 | 12.257 |
| 0.6319444444444444 | 12.257 |
| 0.6326388888888889 | 7.887 |
| 0.6333333333333333 | 7.887 |
| 0.6340277777777777 | 7.887 |
| 0.6347222222222222 | 7.887 |
| 0.6354166666666666 | 7.887 |
| 0.6361111111111112 | 3.525 |
| 0.6368055555555555 | 3.525 |
| 0.6375000000000001 | 3.525 |
| 0.6381944444444444 | 3.525 |
| 0.638888888888889 | 3.525 |
| 0.6395833333333333 | 3.525 |
| 0.6402777777777778 | 3.525 |
| 0.6409722222222222 | 3.525 |
| 0.6416666666666667 | 3.525 |
| 0.642361111111111 | 3.525 |
| 0.6430555555555556 | 3.525 |
| 0.6437499999999999 | 3.525 |
| 0.6444444444444445 | 3.525 |
| 0.6451388888888888 | 0 |
| 0.6458333333333334 | 3.525 |
| 0.6465277777777778 | 3.525 |
| 0.6472222222222223 | 0 |
| 0.6479166666666667 | 0 |
| 0.6486111111111111 | 3.525 |
| 0.6493055555555556 | 0 |
| 0.65 | 0 |
| 0.6506944444444445 | 0 |
| 0.6513888888888889 | 0 |
| 0.6520833333333333 | 0 |
| 0.6527777777777778 | 0 |
| 0.6534722222222222 | 0 |
| 0.6541666666666667 | 0 |
| 0.6548611111111111 | 0 |
| 0.6555555555555556 | 0 |
| 0.65625 | 0 |
| 0.6569444444444444 | 0 |
| 0.6576388888888889 | 0 |
| 0.6583333333333333 | 0 |
| 0.6590277777777778 | 0 |
| 0.6597222222222222 | 0 |
| 0.6604166666666667 | 0 |
| 0.6611111111111111 | 0 |
| 0.6618055555555555 | 0 |
| 0.6625 | 0 |
| 0.6631944444444444 | 0 |
| 0.6638888888888889 | 0 |
| 0.6645833333333333 | 0 |
| 0.6652777777777777 | 0 |
| 0.6659722222222222 | 0 |
| 0.6666666666666666 | 0 |
| 0.6673611111111111 | 0 |
| 0.6680555555555556 | 0 |
| 0.6687500000000001 | 0 |
| 0.6694444444444444 | 0 |
| 0.6701388888888888 | 0 |
| 0.6708333333333334 | 0 |
| 0.6715277777777778 | 0 |
| 0.6722222222222222 | 0 |
| 0.6729166666666666 | 0 |
| 0.6736111111111112 | 0 |
| 0.6743055555555556 | 0 |
| 0.6749999999999999 | 0 |
| 0.6756944444444444 | 0 |
| 0.6763888888888889 | 0 |
| 0.6770833333333334 | 0 |
| 0.6777777777777777 | 0 |
| 0.6784722222222223 | 0 |
| 0.6791666666666667 | 0 |
| 0.6798611111111111 | 0 |
| 0.6805555555555555 | 0 |
| 0.68125 | 0 |
| 0.6819444444444445 | 0 |
| 0.6826388888888889 | 0 |
| 0.6833333333333332 | 0 |
| 0.6840277777777778 | 0 |
| 0.6847222222222222 | 0 |
| 0.6854166666666667 | 0 |
| 0.686111111111111 | 0 |
| 0.6868055555555556 | 0 |
| 0.6875 | 0 |
| 0.6881944444444444 | 0 |
| 0.688888888888889 | 0 |
| 0.6895833333333333 | 0 |
| 0.6902777777777778 | 0 |
| 0.6909722222222222 | 0 |
| 0.6916666666666668 | 0 |
| 0.6923611111111111 | 0 |
| 0.6930555555555555 | 0 |
| 0.69375 | 0 |
| 0.6944444444444445 | 0 |
| 0.6951388888888889 | 0 |
| 0.6958333333333333 | 0 |
| 0.6965277777777777 | 0 |
| 0.6972222222222223 | 0 |
| 0.6979166666666666 | 0 |
| 0.6986111111111111 | 0 |
| 0.6993055555555556 | 0 |
| 0.7000000000000001 | 0 |
| 0.7006944444444444 | 0 |
| 0.7013888888888888 | 0 |
| 0.7020833333333334 | 0 |
| 0.7027777777777778 | 0 |
| 0.7034722222222222 | 0 |
| 0.7041666666666666 | 0 |
| 0.7048611111111112 | 0 |
| 0.7055555555555556 | 0 |
| 0.7062499999999999 | 0 |
| 0.7069444444444444 | 0 |
| 0.7076388888888889 | 0 |
| 0.7083333333333334 | 0 |
| 0.7090277777777777 | 0 |
| 0.7097222222222223 | 0 |
| 0.7104166666666667 | 0 |
| 0.7111111111111111 | 0 |
| 0.7118055555555555 | 0 |
| 0.7125 | 0 |
| 0.7131944444444445 | 0 |
| 0.7138888888888889 | 0 |
| 0.7145833333333332 | 0 |
| 0.7152777777777778 | 0 |
| 0.7159722222222222 | 0 |
| 0.7166666666666667 | 0 |
| 0.717361111111111 | 0 |
| 0.7180555555555556 | 0 |
| 0.71875 | 0 |
| 0.7194444444444444 | 0 |
| 0.720138888888889 | 0 |
| 0.7208333333333333 | 0 |
| 0.7215277777777778 | 0 |
| 0.7222222222222222 | 0 |
| 0.7229166666666668 | 0 |
| 0.7236111111111111 | 0 |
| 0.7243055555555555 | 0 |
| 0.725 | 0 |
| 0.7256944444444445 | 0 |
| 0.7263888888888889 | 0 |
| 0.7270833333333333 | 0 |
| 0.7277777777777777 | 0 |
| 0.7284722222222223 | 0 |
| 0.7291666666666666 | 0 |
| 0.7298611111111111 | 0 |
| 0.7305555555555556 | 0 |
| 0.7312500000000001 | 0 |
| 0.7319444444444444 | 0 |
| 0.7326388888888888 | 0 |
| 0.7333333333333334 | 0 |
| 0.7340277777777778 | 0 |
| 0.7347222222222222 | 0 |
| 0.7354166666666666 | 0 |
| 0.7361111111111112 | 0 |
| 0.7368055555555556 | 0 |
| 0.7374999999999999 | 0 |
| 0.7381944444444444 | 0 |
| 0.7388888888888889 | 0 |
| 0.7395833333333334 | 0 |
| 0.7402777777777777 | 0 |
| 0.7409722222222223 | 0 |
| 0.7416666666666667 | 0 |
| 0.7423611111111111 | 0 |
| 0.7430555555555555 | 0 |
| 0.74375 | 0 |
| 0.7444444444444445 | 0 |
| 0.7451388888888889 | 0 |
| 0.7458333333333332 | 0 |
| 0.7465277777777778 | 0 |
| 0.7472222222222222 | 0 |
| 0.7479166666666667 | 0 |
| 0.748611111111111 | 0 |
| 0.7493055555555556 | 0 |
| 0.75 | 0 |
| 0.7506944444444444 | 0 |
| 0.751388888888889 | 0 |
| 0.7520833333333333 | 0 |
| 0.7527777777777778 | 0 |
| 0.7534722222222222 | 0 |
| 0.7541666666666668 | 0 |
| 0.7548611111111111 | 0 |
| 0.7555555555555555 | 0 |
| 0.75625 | 0 |
| 0.7569444444444445 | 0 |
| 0.7576388888888889 | 0 |
| 0.7583333333333333 | 0 |
| 0.7590277777777777 | 0 |
| 0.7597222222222223 | 0 |
| 0.7604166666666666 | 0 |
| 0.7611111111111111 | 0 |
| 0.7618055555555556 | 0 |
| 0.7625000000000001 | 0 |
| 0.7631944444444444 | 0 |
| 0.7638888888888888 | 0 |
| 0.7645833333333334 | 0 |
| 0.7652777777777778 | 0 |
| 0.7659722222222222 | 0 |
| 0.7666666666666666 | 0 |
| 0.7673611111111112 | 0 |
| 0.7680555555555556 | 0 |
| 0.7687499999999999 | 0 |
| 0.7694444444444444 | 0 |
| 0.7701388888888889 | 0 |
| 0.7708333333333334 | 0 |
| 0.7715277777777777 | 0 |
| 0.7722222222222223 | 0 |
| 0.7729166666666667 | 0 |
| 0.7736111111111111 | 0 |
| 0.7743055555555555 | 0 |
| 0.775 | 0 |
| 0.7756944444444445 | 0 |
| 0.7763888888888889 | 0 |
| 0.7770833333333332 | 0 |
| 0.7777777777777778 | 0 |
| 0.7784722222222222 | 0 |
| 0.7791666666666667 | 0 |
| 0.779861111111111 | 0 |
| 0.7805555555555556 | 0 |
| 0.78125 | 0 |
| 0.7819444444444444 | 0 |
| 0.782638888888889 | 0 |
| 0.7833333333333333 | 0 |
| 0.7840277777777778 | 0 |
| 0.7847222222222222 | 0 |
| 0.7854166666666668 | 0 |
| 0.7861111111111111 | 0 |
| 0.7868055555555555 | 0 |
| 0.7875 | 0 |
| 0.7881944444444445 | 0 |
| 0.7888888888888889 | 0 |
| 0.7895833333333333 | 0 |
| 0.7902777777777777 | 0 |
| 0.7909722222222223 | 0 |
| 0.7916666666666666 | 0 |
| 0.7923611111111111 | 0 |
| 0.7930555555555556 | 0 |
| 0.7937500000000001 | 0 |
| 0.7944444444444444 | 0 |
| 0.7951388888888888 | 0 |
| 0.7958333333333334 | 0 |
| 0.7965277777777778 | 0 |
| 0.7972222222222222 | 0 |
| 0.7979166666666666 | 0 |
| 0.7986111111111112 | 0 |
| 0.7993055555555556 | 0 |
| 0.7999999999999999 | 0 |
| 0.8006944444444444 | 0 |
| 0.8013888888888889 | 0 |
| 0.8020833333333334 | 0 |
| 0.8027777777777777 | 0 |
| 0.8034722222222223 | 0 |
| 0.8041666666666667 | 0 |
| 0.8048611111111111 | 0 |
| 0.8055555555555555 | 0 |
| 0.80625 | 0 |
| 0.8069444444444445 | 0 |
| 0.8076388888888889 | 0 |
| 0.8083333333333332 | 0 |
| 0.8090277777777778 | 0 |
| 0.8097222222222222 | 0 |
| 0.8104166666666667 | 0 |
| 0.811111111111111 | 0 |
| 0.8118055555555556 | 0 |
| 0.8125 | 0 |
| 0.8131944444444444 | 0 |
| 0.813888888888889 | 0 |
| 0.8145833333333333 | 0 |
| 0.8152777777777778 | 0 |
| 0.8159722222222222 | 0 |
| 0.8166666666666668 | 0 |
| 0.8173611111111111 | 0 |
| 0.8180555555555555 | 0 |
| 0.81875 | 0 |
| 0.8194444444444445 | 0 |
| 0.8201388888888889 | 0 |
| 0.8208333333333333 | 0 |
| 0.8215277777777777 | 0 |
| 0.8222222222222223 | 0 |
| 0.8229166666666666 | 0 |
| 0.8236111111111111 | 0 |
| 0.8243055555555556 | 0 |
| 0.8250000000000001 | 0 |
| 0.8256944444444444 | 0 |
| 0.8263888888888888 | 0 |
| 0.8270833333333334 | 0 |
| 0.8277777777777778 | 0 |
| 0.8284722222222222 | 0 |
| 0.8291666666666666 | 0 |
| 0.8298611111111112 | 0 |
| 0.8305555555555556 | 0 |
| 0.8312499999999999 | 0 |
| 0.8319444444444444 | 0 |
| 0.8326388888888889 | 0 |
| 0.8333333333333334 | 0 |
| 0.8340277777777777 | 0 |
| 0.8347222222222223 | 0 |
| 0.8354166666666667 | 0 |
| 0.8361111111111111 | 0 |
| 0.8368055555555555 | 0 |
| 0.8375 | 0 |
| 0.8381944444444445 | 0 |
| 0.8388888888888889 | 0 |
| 0.8395833333333332 | 0 |
| 0.8402777777777778 | 0 |
| 0.8409722222222222 | 0 |
| 0.8416666666666667 | 0 |
| 0.842361111111111 | 0 |
| 0.8430555555555556 | 0 |
| 0.84375 | 0 |
| 0.8444444444444444 | 0 |
| 0.845138888888889 | 0 |
| 0.8458333333333333 | 0 |
| 0.8465277777777778 | 0 |
| 0.8472222222222222 | 0 |
| 0.8479166666666668 | 0 |
| 0.8486111111111111 | 0 |
| 0.8493055555555555 | 0 |
| 0.85 | 0 |
| 0.8506944444444445 | 0 |
| 0.8513888888888889 | 0 |
| 0.8520833333333333 | 0 |
| 0.8527777777777777 | 0 |
| 0.8534722222222223 | 0 |
| 0.8541666666666666 | 0 |
| 0.8548611111111111 | 0 |
| 0.8555555555555556 | 0 |
| 0.8562500000000001 | 0 |
| 0.8569444444444444 | 0 |
| 0.8576388888888888 | 0 |
| 0.8583333333333334 | 0 |
| 0.8590277777777778 | 0 |
| 0.8597222222222222 | 0 |
| 0.8604166666666666 | 0 |
| 0.8611111111111112 | 0 |
| 0.8618055555555556 | 0 |
| 0.8624999999999999 | 0 |
| 0.8631944444444444 | 0 |
| 0.8638888888888889 | 0 |
| 0.8645833333333334 | 0 |
| 0.8652777777777777 | 0 |
| 0.8659722222222223 | 0 |
| 0.8666666666666667 | 0 |
| 0.8673611111111111 | 0 |
| 0.8680555555555555 | 0 |
| 0.86875 | 0 |
| 0.8694444444444445 | 0 |
| 0.8701388888888889 | 0 |
| 0.8708333333333332 | 0 |
| 0.8715277777777778 | 0 |
| 0.8722222222222222 | 0 |
| 0.8729166666666667 | 0 |
| 0.873611111111111 | 0 |
| 0.8743055555555556 | 0 |
| 0.875 | 0 |
| 0.8756944444444444 | 0 |
| 0.876388888888889 | 0 |
| 0.8770833333333333 | 0 |
| 0.8777777777777778 | 0 |
| 0.8784722222222222 | 0 |
| 0.8791666666666668 | 0 |
| 0.8798611111111111 | 0 |
| 0.8805555555555555 | 0 |
| 0.88125 | 0 |
| 0.8819444444444445 | 0 |
| 0.8826388888888889 | 0 |
| 0.8833333333333333 | 0 |
| 0.8840277777777777 | 0 |
| 0.8847222222222223 | 0 |
| 0.8854166666666666 | 0 |
| 0.8861111111111111 | 0 |
| 0.8868055555555556 | 0 |
| 0.8875000000000001 | 0 |
| 0.8881944444444444 | 0 |
| 0.8888888888888888 | 0 |
| 0.8895833333333334 | 0 |
| 0.8902777777777778 | 0 |
| 0.8909722222222222 | 0 |
| 0.8916666666666666 | 0 |
| 0.8923611111111112 | 0 |
| 0.8930555555555556 | 0 |
| 0.8937499999999999 | 0 |
| 0.8944444444444444 | 0 |
| 0.8951388888888889 | 0 |
| 0.8958333333333334 | 0 |
| 0.8965277777777777 | 0 |
| 0.8972222222222223 | 0 |
| 0.8979166666666667 | 0 |
| 0.8986111111111111 | 0 |
| 0.8993055555555555 | 0 |
| 0.9 | 0 |
| 0.9006944444444445 | 0 |
| 0.9013888888888889 | 0 |
| 0.9020833333333332 | 0 |
| 0.9027777777777778 | 0 |
| 0.9034722222222222 | 0 |
| 0.9041666666666667 | 0 |
| 0.904861111111111 | 0 |
| 0.9055555555555556 | 0 |
| 0.90625 | 0 |
| 0.9069444444444444 | 0 |
| 0.907638888888889 | 0 |
| 0.9083333333333333 | 0 |
| 0.9090277777777778 | 0 |
| 0.9097222222222222 | 0 |
| 0.9104166666666668 | 0 |
| 0.9111111111111111 | 0 |
| 0.9118055555555555 | 0 |
| 0.9125 | 0 |
| 0.9131944444444445 | 0 |
| 0.9138888888888889 | 0 |
| 0.9145833333333333 | 0 |
| 0.9152777777777777 | 0 |
| 0.9159722222222223 | 0 |
| 0.9166666666666666 | 0 |
| 0.9173611111111111 | 0 |
| 0.9180555555555556 | 0 |
| 0.9187500000000001 | 0 |
| 0.9194444444444444 | 0 |
| 0.9201388888888888 | 0 |
| 0.9208333333333334 | 0 |
| 0.9215277777777778 | 0 |
| 0.9222222222222222 | 0 |
| 0.9229166666666666 | 0 |
| 0.9236111111111112 | 0 |
| 0.9243055555555556 | 0 |
| 0.9249999999999999 | 0 |
| 0.9256944444444444 | 0 |
| 0.9263888888888889 | 0 |
| 0.9270833333333334 | 0 |
| 0.9277777777777777 | 0 |
| 0.9284722222222223 | 0 |
| 0.9291666666666667 | 0 |
| 0.9298611111111111 | 0 |
| 0.9305555555555555 | 0 |
| 0.93125 | 0 |
| 0.9319444444444445 | 0 |
| 0.9326388888888889 | 0 |
| 0.9333333333333332 | 0 |
| 0.9340277777777778 | 0 |
| 0.9347222222222222 | 0 |
| 0.9354166666666667 | 0 |
| 0.936111111111111 | 0 |
| 0.9368055555555556 | 0 |
| 0.9375 | 0 |
| 0.9381944444444444 | 0 |
| 0.938888888888889 | 0 |
| 0.9395833333333333 | 0 |
| 0.9402777777777778 | 0 |
| 0.9409722222222222 | 0 |
| 0.9416666666666668 | 0 |
| 0.9423611111111111 | 0 |
| 0.9430555555555555 | 0 |
| 0.94375 | 0 |
| 0.9444444444444445 | 0 |
| 0.9451388888888889 | 0 |
| 0.9458333333333333 | 0 |
| 0.9465277777777777 | 0 |
| 0.9472222222222223 | 0 |
| 0.9479166666666666 | 0 |
| 0.9486111111111111 | 0 |
| 0.9493055555555556 | 0 |
| 0.9500000000000001 | 0 |
| 0.9506944444444444 | 0 |
| 0.9513888888888888 | 0 |
| 0.9520833333333334 | 0 |
| 0.9527777777777778 | 0 |
| 0.9534722222222222 | 0 |
| 0.9541666666666666 | 0 |
| 0.9548611111111112 | 0 |
| 0.9555555555555556 | 0 |
| 0.9562499999999999 | 0 |
| 0.9569444444444444 | 0 |
| 0.9576388888888889 | 0 |
| 0.9583333333333334 | 0 |
| 0.9590277777777777 | 0 |
| 0.9597222222222223 | 0 |
| 0.9604166666666667 | 0 |
| 0.9611111111111111 | 0 |
| 0.9618055555555555 | 0 |
| 0.9625 | 0 |
| 0.9631944444444445 | 0 |
| 0.9638888888888889 | 0 |
| 0.9645833333333332 | 0 |
| 0.9652777777777778 | 0 |
| 0.9659722222222222 | 0 |
| 0.9666666666666667 | 0 |
| 0.967361111111111 | 0 |
| 0.9680555555555556 | 0 |
| 0.96875 | 0 |
| 0.9694444444444444 | 0 |
| 0.970138888888889 | 0 |
| 0.9708333333333333 | 0 |
| 0.9715277777777778 | 0 |
| 0.9722222222222222 | 0 |
| 0.9729166666666668 | 0 |
| 0.9736111111111111 | 0 |
| 0.9743055555555555 | 0 |
| 0.975 | 0 |
| 0.9756944444444445 | 0 |
| 0.9763888888888889 | 0 |
| 0.9770833333333333 | 0 |
| 0.9777777777777777 | 0 |
| 0.9784722222222223 | 0 |
| 0.9791666666666666 | 0 |
| 0.9798611111111111 | 0 |
| 0.9805555555555556 | 0 |
| 0.9812500000000001 | 0 |
| 0.9819444444444444 | 0 |
| 0.9826388888888888 | 0 |
| 0.9833333333333334 | 0 |
| 0.9840277777777778 | 0 |
| 0.9847222222222222 | 0 |
| 0.9854166666666666 | 0 |
| 0.9861111111111112 | 0 |
| 0.9868055555555556 | 0 |
| 0.9874999999999999 | 0 |
| 0.9881944444444444 | 0 |
| 0.9888888888888889 | 0 |
| 0.9895833333333334 | 0 |
| 0.9902777777777777 | 0 |
| 0.9909722222222223 | 0 |
| 0.9916666666666667 | 0 |
| 0.9923611111111111 | 0 |
| 0.9930555555555555 | 0 |
| 0.99375 | 0 |
| 0.9944444444444445 | 0 |
| 0.9951388888888889 | 0 |
| 0.9958333333333332 | 0 |
| 0.9965277777777778 | 0 |
| 0.9972222222222222 | 0 |
| 0.9979166666666667 | 0 |
| 0.998611111111111 | 0 |
| 0.9993055555555556 | 0 |